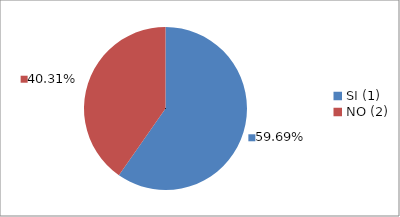
| Category | Series 0 |
|---|---|
| SI (1) | 0.597 |
| NO (2) | 0.403 |